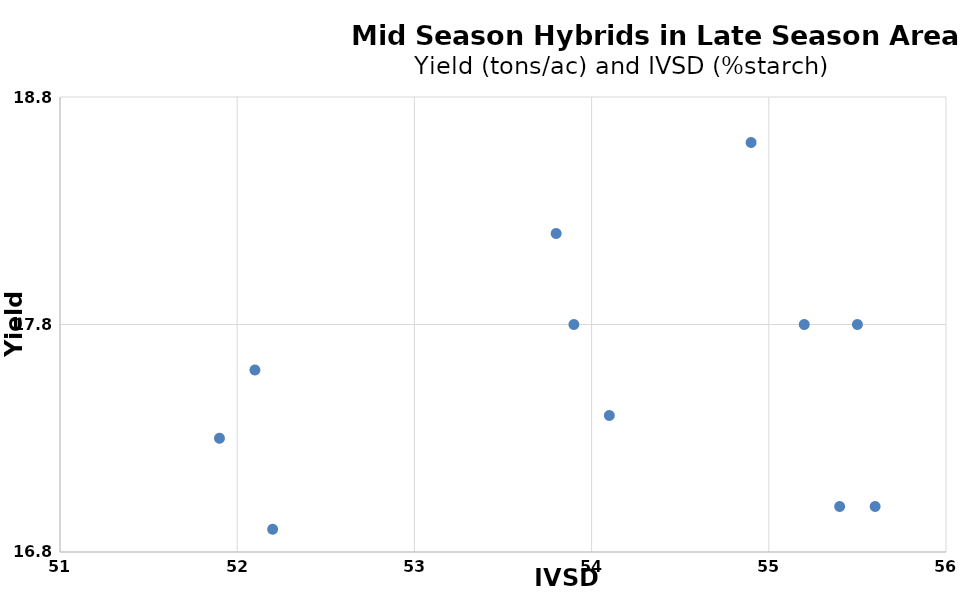
| Category | Series 0 |
|---|---|
| 54.9 | 18.6 |
| 53.8 | 18.2 |
| 51.9 | 17.3 |
| 55.4 | 17 |
| 54.1 | 17.4 |
| 52.2 | 16.9 |
| 53.9 | 17.8 |
| 55.5 | 17.8 |
| 55.6 | 17 |
| 52.1 | 17.6 |
| 55.2 | 17.8 |